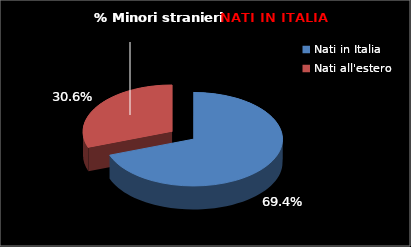
| Category | Series 0 |
|---|---|
| Nati in Italia | 275 |
| Nati all'estero | 121 |